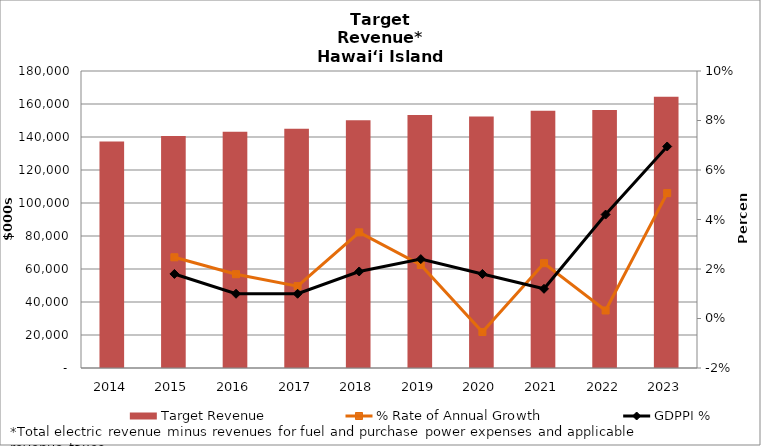
| Category | Target Revenue |
|---|---|
| 2014.0 | 137247.762 |
| 2015.0 | 140642.437 |
| 2016.0 | 143160.741 |
| 2017.0 | 145034.145 |
| 2018.0 | 150080.699 |
| 2019.0 | 153324.004 |
| 2020.0 | 152489.878 |
| 2021.0 | 155897.762 |
| 2022.0 | 156403.198 |
| 2023.0 | 164327.619 |